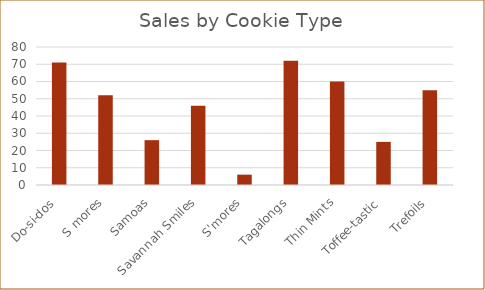
| Category | Total |
|---|---|
| Do-si-dos | 71 |
| S mores | 52 |
| Samoas | 26 |
| Savannah Smiles | 46 |
| S'mores | 6 |
| Tagalongs | 72 |
| Thin Mints | 60 |
| Toffee-tastic | 25 |
| Trefoils | 55 |